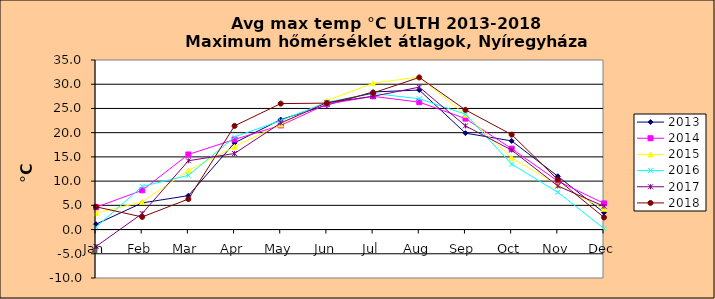
| Category | 2013 | 2014 | 2015 | 2016 | 2017 | 2018 |
|---|---|---|---|---|---|---|
| Jan | 1.1 | 4.6 | 3.4 | 0.5 | -3.5 | 4.7 |
| Feb | 5.5 | 8.1 | 5.7 | 8.9 | 3.3 | 2.6 |
| Mar | 7 | 15.5 | 12.2 | 11.2 | 14.2 | 6.3 |
| Apr | 17.9 | 18.6 | 17.1 | 19.1 | 15.7 | 21.4 |
| May | 22.7 | 21.5 | 21.7 | 22.5 | 22 | 26 |
| Jun | 25.7 | 25.9 | 26.6 | 26.3 | 26.2 | 26.1 |
| Jul | 28.4 | 27.5 | 30.2 | 28.1 | 27.5 | 28.2 |
| Aug | 28.8 | 26.3 | 31.5 | 27 | 29.4 | 31.4 |
| Sep | 19.9 | 22.9 | 23.7 | 23.8 | 21.4 | 24.7 |
| Oct | 18.3 | 16.7 | 14.8 | 13.5 | 16.4 | 19.6 |
| Nov | 11 | 10 | 9.2 | 7.7 | 9 | 10.3 |
| Dec | 3.5 | 5.4 | 4.3 | 0.2 | 4.8 | 2.5 |